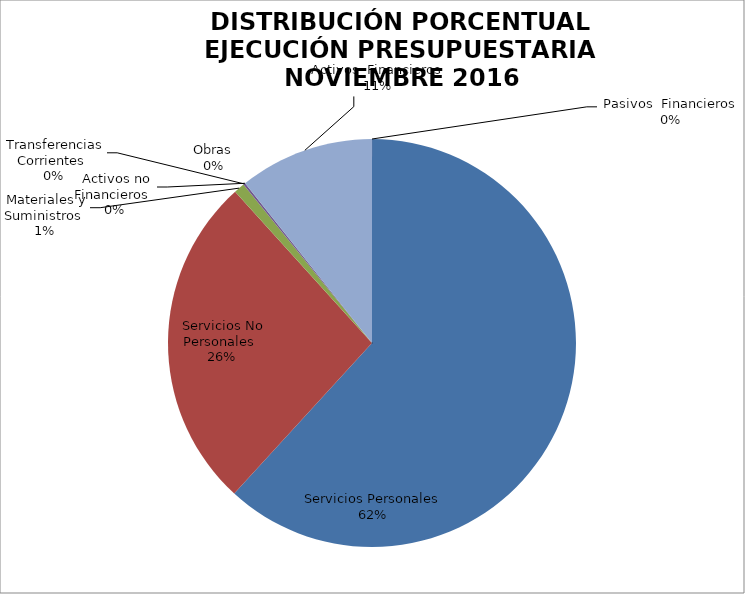
| Category | Series 0 | Series 1 |
|---|---|---|
| Servicios Personales | 11137452.89 | 0.786 |
| Servicios No Personales | 4774964.96 | 0.337 |
| Materiales y Suministros | 153713.17 | 0.011 |
| Transferencias Corrientes | 30000 | 0 |
| Activos no Financieros | 0 | 0 |
| Obras | 0 | 0 |
| Activos  Financieros | -1925759.47 | -0.136 |
| Pasivos  Financieros | 0 | 0 |